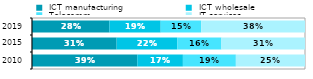
| Category |  ICT manufacturing |  ICT wholesale |  Telecomm. |  IT services |
|---|---|---|---|---|
| 2010.0 | 0.386 | 0.167 | 0.194 | 0.253 |
| 2015.0 | 0.31 | 0.222 | 0.162 | 0.306 |
| 2019.0 | 0.284 | 0.188 | 0.148 | 0.38 |